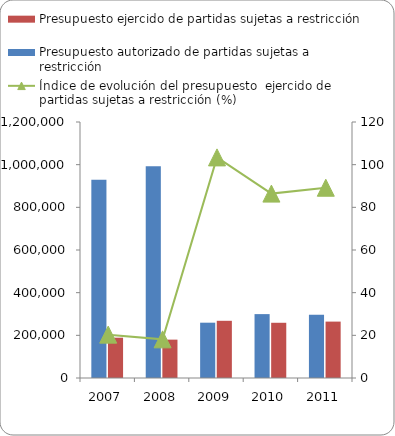
| Category | Presupuesto autorizado de partidas sujetas a restricción | Presupuesto ejercido de partidas sujetas a restricción  |
|---|---|---|
| 2007 | 929380 | 188945 |
| 2008 | 992437 | 179800 |
| 2009 | 259279 | 268119 |
| 2010 | 299481 | 258863 |
| 2011 | 296437.9 | 264391.5 |